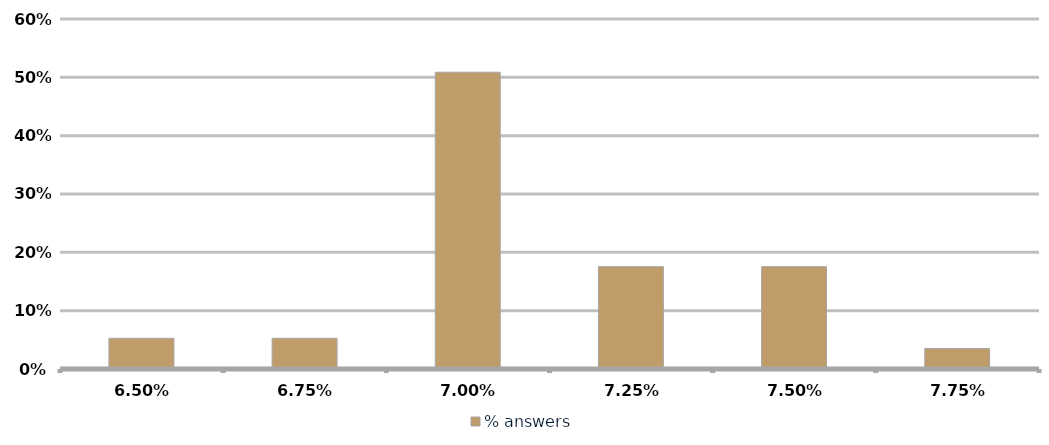
| Category | % answers |
|---|---|
| 0.065 | 0.053 |
| 0.0675 | 0.053 |
| 0.07 | 0.509 |
| 0.07250000000000001 | 0.175 |
| 0.07500000000000001 | 0.175 |
| 0.07750000000000001 | 0.035 |